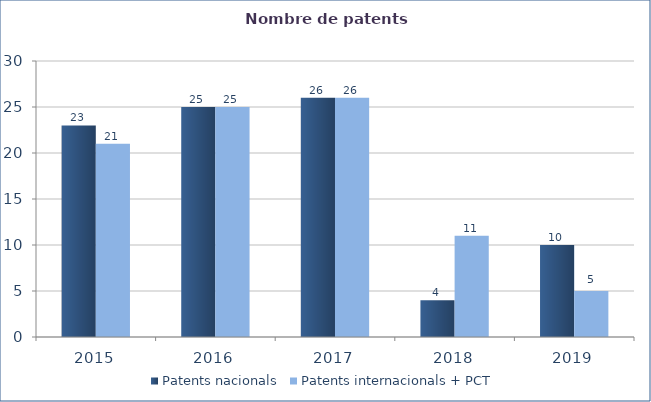
| Category | Patents nacionals | Patents internacionals + PCT |
|---|---|---|
| 2015.0 | 23 | 21 |
| 2016.0 | 25 | 25 |
| 2017.0 | 26 | 26 |
| 2018.0 | 4 | 11 |
| 2019.0 | 10 | 5 |